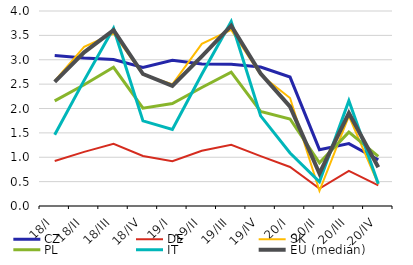
| Category | CZ | DE | SK | PL | IT | EU (medián) |
|---|---|---|---|---|---|---|
| 18/I | 3.088 | 0.925 | 2.568 | 2.156 | 1.462 | 2.545 |
| 18/II | 3.038 | 1.11 | 3.265 | 2.488 | 2.577 | 3.151 |
| 18/III | 3.004 | 1.275 | 3.539 | 2.844 | 3.646 | 3.608 |
| 18/IV | 2.844 | 1.025 | 2.694 | 2.005 | 1.746 | 2.708 |
| 19/I | 2.989 | 0.919 | 2.497 | 2.101 | 1.568 | 2.463 |
| 19/II | 2.914 | 1.132 | 3.326 | 2.43 | 2.703 | 3.068 |
| 19/III | 2.909 | 1.254 | 3.613 | 2.748 | 3.784 | 3.699 |
| 19/IV | 2.849 | 1.023 | 2.692 | 1.939 | 1.849 | 2.718 |
| 20/I | 2.645 | 0.8 | 2.216 | 1.785 | 1.087 | 2.037 |
| 20/II | 1.156 | 0.356 | 0.312 | 0.886 | 0.496 | 0.667 |
| 20/III | 1.28 | 0.722 | 1.845 | 1.515 | 2.16 | 1.906 |
| 20/IV | 0.949 | 0.423 | 0.447 | 1.019 | 0.458 | 0.796 |